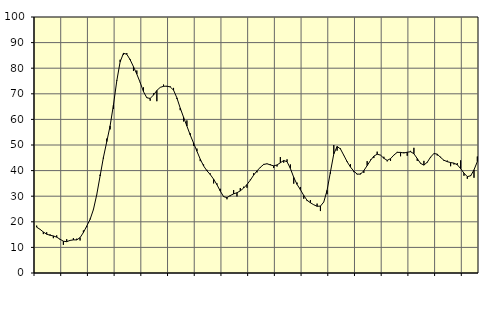
| Category | Piggar | Series 1 |
|---|---|---|
| nan | 18.5 | 17.9 |
| 87.0 | 17.1 | 17.07 |
| 87.0 | 15.2 | 16.02 |
| 87.0 | 15.9 | 15.16 |
| nan | 15.1 | 14.74 |
| 88.0 | 13.6 | 14.48 |
| 88.0 | 14.7 | 14 |
| 88.0 | 13 | 13.2 |
| nan | 11 | 12.41 |
| 89.0 | 13.2 | 12.24 |
| 89.0 | 12.7 | 12.73 |
| 89.0 | 13.6 | 12.94 |
| nan | 13.4 | 12.93 |
| 90.0 | 12.7 | 13.82 |
| 90.0 | 16.6 | 15.82 |
| 90.0 | 17.9 | 18.33 |
| nan | 21.2 | 20.95 |
| 91.0 | 24.6 | 24.78 |
| 91.0 | 30.7 | 30.62 |
| 91.0 | 38.4 | 37.9 |
| nan | 44.7 | 45.17 |
| 92.0 | 52.5 | 51.31 |
| 92.0 | 56.1 | 57.49 |
| 92.0 | 64.1 | 65.64 |
| nan | 75.3 | 75.07 |
| 93.0 | 83.3 | 82.49 |
| 93.0 | 85.2 | 85.81 |
| 93.0 | 85.9 | 85.46 |
| nan | 83.6 | 83.3 |
| 94.0 | 78.9 | 80.58 |
| 94.0 | 79.1 | 77.7 |
| 94.0 | 74.3 | 74.43 |
| nan | 72.5 | 70.84 |
| 95.0 | 68.6 | 68.44 |
| 95.0 | 67.3 | 68.19 |
| 95.0 | 70.2 | 69.52 |
| nan | 67.1 | 71.3 |
| 96.0 | 72.5 | 72.5 |
| 96.0 | 73.6 | 72.93 |
| 96.0 | 72.8 | 72.99 |
| nan | 72.9 | 72.68 |
| 97.0 | 72.3 | 71.45 |
| 97.0 | 68 | 68.41 |
| 97.0 | 63.6 | 64.45 |
| nan | 59.2 | 60.84 |
| 98.0 | 59.6 | 57.4 |
| 98.0 | 54.6 | 53.92 |
| 98.0 | 49.7 | 50.76 |
| nan | 48.6 | 47.58 |
| 99.0 | 43.7 | 44.48 |
| 99.0 | 42.4 | 41.83 |
| 99.0 | 40.3 | 39.93 |
| nan | 38.9 | 38.46 |
| 0.0 | 35 | 36.65 |
| 0.0 | 35 | 34.51 |
| 0.0 | 32.9 | 31.99 |
| nan | 29.7 | 29.83 |
| 1.0 | 28.8 | 29.45 |
| 1.0 | 30 | 30.26 |
| 1.0 | 32.4 | 30.92 |
| nan | 29.9 | 31.35 |
| 2.0 | 33.2 | 32.09 |
| 2.0 | 33.7 | 33.19 |
| 2.0 | 33.3 | 34.56 |
| nan | 36.5 | 36.28 |
| 3.0 | 39 | 38.24 |
| 3.0 | 39.3 | 39.9 |
| 3.0 | 41.1 | 41.29 |
| nan | 42.6 | 42.4 |
| 4.0 | 42.6 | 42.67 |
| 4.0 | 42.5 | 42.22 |
| 4.0 | 41 | 41.86 |
| nan | 41.6 | 42.21 |
| 5.0 | 45.3 | 43.07 |
| 5.0 | 43.1 | 43.94 |
| 5.0 | 44.4 | 43.48 |
| nan | 42.4 | 40.83 |
| 6.0 | 34.9 | 37.36 |
| 6.0 | 35.3 | 34.61 |
| 6.0 | 33.6 | 32.54 |
| nan | 29 | 30.3 |
| 7.0 | 28.1 | 28.4 |
| 7.0 | 28.5 | 27.44 |
| 7.0 | 26.6 | 26.66 |
| nan | 27.1 | 26.05 |
| 8.0 | 24.2 | 26.13 |
| 8.0 | 27.7 | 27.72 |
| 8.0 | 30.8 | 32.32 |
| nan | 38.8 | 39.52 |
| 9.0 | 50 | 46.51 |
| 9.0 | 47.8 | 49.43 |
| 9.0 | 48.7 | 48.46 |
| nan | 45.9 | 45.98 |
| 10.0 | 43.7 | 43.47 |
| 10.0 | 42.5 | 41.37 |
| 10.0 | 39.4 | 39.8 |
| nan | 38.5 | 38.65 |
| 11.0 | 38.9 | 38.6 |
| 11.0 | 39.1 | 39.99 |
| 11.0 | 43.7 | 41.96 |
| nan | 44.3 | 43.97 |
| 12.0 | 44.9 | 45.66 |
| 12.0 | 47.4 | 46.39 |
| 12.0 | 46.1 | 46.05 |
| nan | 45.4 | 44.8 |
| 13.0 | 43.6 | 44 |
| 13.0 | 43.8 | 44.66 |
| 13.0 | 46.1 | 46.06 |
| nan | 47.3 | 47.12 |
| 14.0 | 45.6 | 47.11 |
| 14.0 | 47.2 | 46.88 |
| 14.0 | 45.8 | 47.18 |
| nan | 47.7 | 47.38 |
| 15.0 | 48.9 | 46.58 |
| 15.0 | 43.8 | 44.7 |
| 15.0 | 43 | 42.81 |
| nan | 43.8 | 42.14 |
| 16.0 | 43.1 | 43.28 |
| 16.0 | 45.1 | 45.28 |
| 16.0 | 46.8 | 46.69 |
| nan | 45.9 | 46.42 |
| 17.0 | 45.4 | 45.14 |
| 17.0 | 43.8 | 44.04 |
| 17.0 | 43.9 | 43.49 |
| nan | 41.7 | 43.14 |
| 18.0 | 42.4 | 42.92 |
| 18.0 | 42.9 | 42.28 |
| 18.0 | 44 | 40.76 |
| nan | 38 | 39 |
| 19.0 | 36.8 | 37.65 |
| 19.0 | 38.2 | 37.96 |
| 19.0 | 37.2 | 40.29 |
| nan | 45.5 | 43.51 |